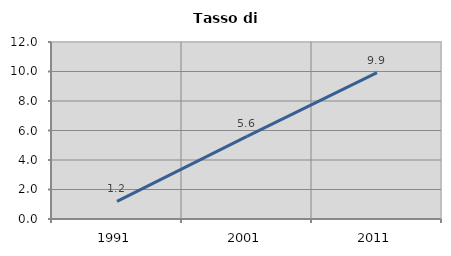
| Category | Tasso di disoccupazione   |
|---|---|
| 1991.0 | 1.19 |
| 2001.0 | 5.6 |
| 2011.0 | 9.924 |